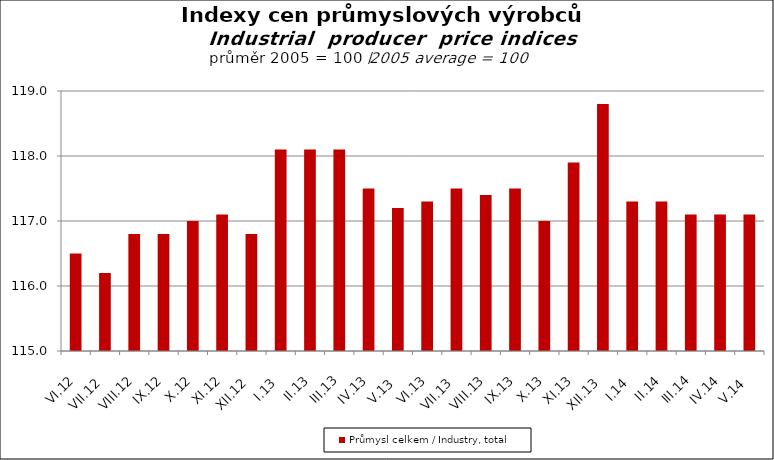
| Category | Průmysl celkem / Industry, total |
|---|---|
| VI.12 | 116.5 |
| VII.12 | 116.2 |
| VIII.12 | 116.8 |
| IX.12 | 116.8 |
| X.12 | 117 |
| XI.12 | 117.1 |
| XII.12 | 116.8 |
| I.13 | 118.1 |
| II.13 | 118.1 |
| III.13 | 118.1 |
| IV.13 | 117.5 |
| V.13 | 117.2 |
| VI.13 | 117.3 |
| VII.13 | 117.5 |
| VIII.13 | 117.4 |
| IX.13 | 117.5 |
| X.13 | 117 |
| XI.13 | 117.9 |
| XII.13 | 118.8 |
| I.14 | 117.3 |
| II.14 | 117.3 |
| III.14 | 117.1 |
| IV.14 | 117.1 |
| V.14 | 117.1 |